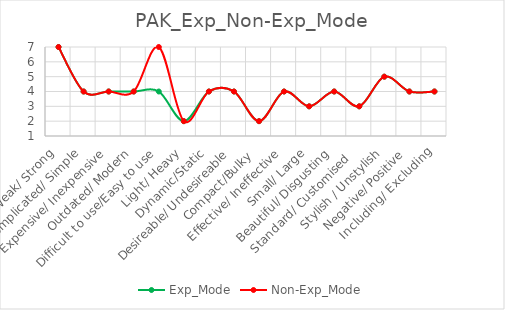
| Category | Exp_Mode | Non-Exp_Mode |
|---|---|---|
| Weak/ Strong | 7 | 7 |
| Complicated/ Simple | 4 | 4 |
| Expensive/ Inexpensive | 4 | 4 |
| Outdated/ Modern | 4 | 4 |
| Difficult to use/Easy to use | 4 | 7 |
| Light/ Heavy | 2 | 2 |
| Dynamic/Static | 4 | 4 |
| Desireable/ Undesireable | 4 | 4 |
| Compact/Bulky  | 2 | 2 |
| Effective/ Ineffective | 4 | 4 |
| Small/ Large | 3 | 3 |
| Beautiful/ Disgusting | 4 | 4 |
| Standard/ Customised   | 3 | 3 |
| Stylish / Unstylish | 5 | 5 |
| Negative/ Positive | 4 | 4 |
| Including/ Excluding | 4 | 4 |